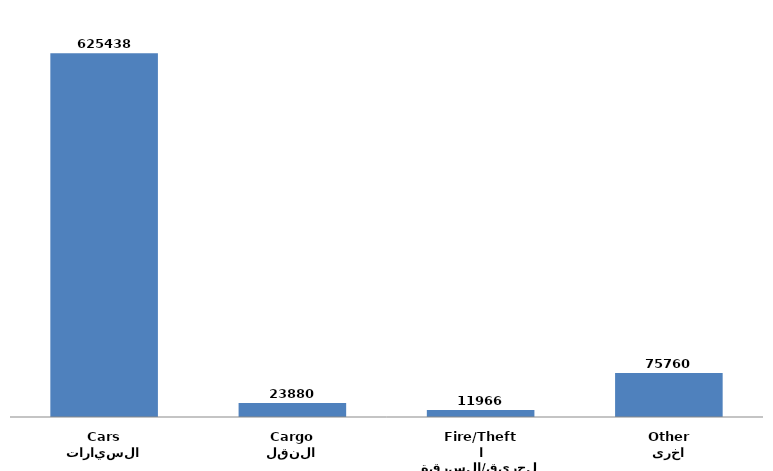
| Category | Series 0 |
|---|---|
| السيارات
Cars | 625438 |
| النقل
Cargo | 23880 |
| الحريق/السرقة
Fire/Theft | 11966 |
| اخرى
Other | 75760 |